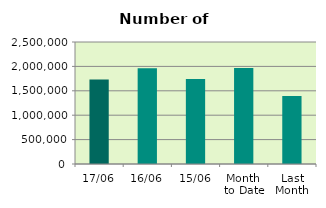
| Category | Series 0 |
|---|---|
| 17/06 | 1730102 |
| 16/06 | 1961204 |
| 15/06 | 1740892 |
| Month 
to Date | 1964839.385 |
| Last
Month | 1395416 |